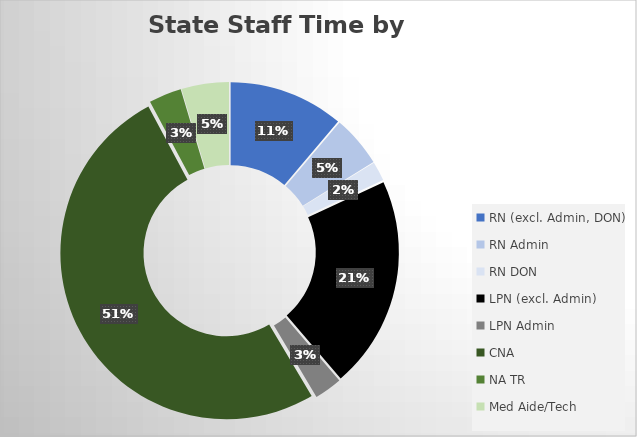
| Category | Series 0 |
|---|---|
| RN (excl. Admin, DON) | 8378.887 |
| RN Admin | 3755.042 |
| RN DON | 1405.925 |
| LPN (excl. Admin) | 15476.003 |
| LPN Admin | 2019.632 |
| CNA | 37999.889 |
| NA TR | 2383.01 |
| Med Aide/Tech | 3457.908 |